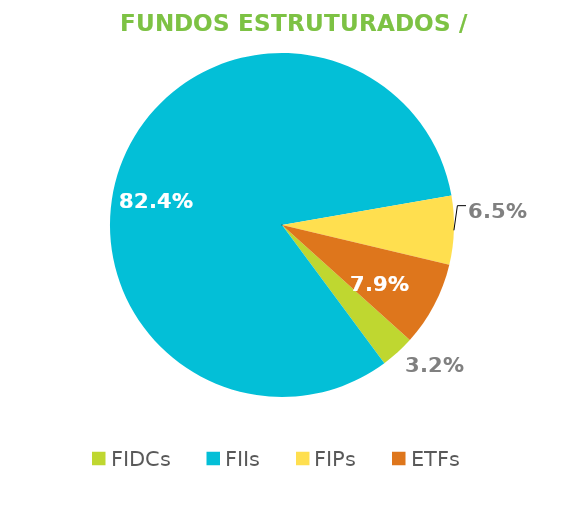
| Category | Fundos Estruturados / ETFs |
|---|---|
| FIDCs | 0.032 |
| FIIs | 0.824 |
| FIPs | 0.065 |
| ETFs | 0.079 |